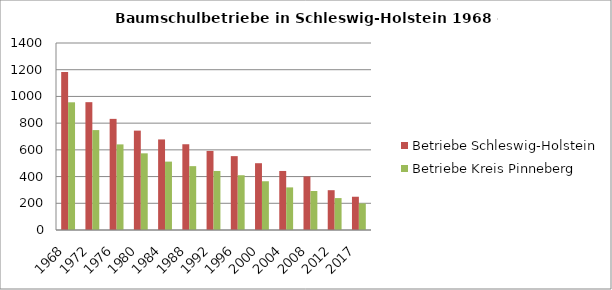
| Category | Betriebe Schleswig-Holstein | Betriebe Kreis Pinneberg |
|---|---|---|
| 1968.0 | 1183 | 956 |
| 1972.0 | 957 | 748 |
| 1976.0 | 832 | 641 |
| 1980.0 | 744 | 574 |
| 1984.0 | 678 | 512 |
| 1988.0 | 642 | 478 |
| 1992.0 | 592 | 442 |
| 1996.0 | 553 | 410 |
| 2000.0 | 500 | 365 |
| 2004.0 | 442 | 319 |
| 2008.0 | 401 | 292 |
| 2012.0 | 298 | 239 |
| 2017.0 | 249 | 199 |